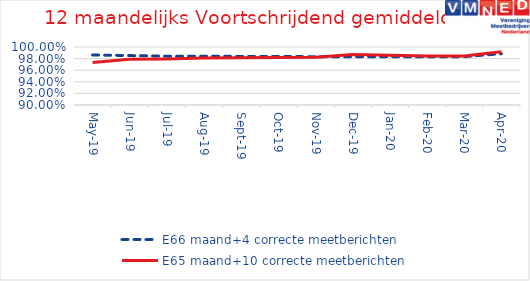
| Category | E66 maand+4 correcte meetberichten | E65 maand+10 correcte meetberichten |
|---|---|---|
| 2019-05-01 | 0.986 | 0.973 |
| 2019-06-01 | 0.985 | 0.979 |
| 2019-07-01 | 0.984 | 0.979 |
| 2019-08-01 | 0.984 | 0.981 |
| 2019-09-01 | 0.984 | 0.982 |
| 2019-10-01 | 0.984 | 0.982 |
| 2019-11-01 | 0.983 | 0.982 |
| 2019-12-01 | 0.983 | 0.987 |
| 2020-01-01 | 0.983 | 0.986 |
| 2020-02-01 | 0.983 | 0.985 |
| 2020-03-01 | 0.983 | 0.984 |
| 2020-04-01 | 0.988 | 0.992 |